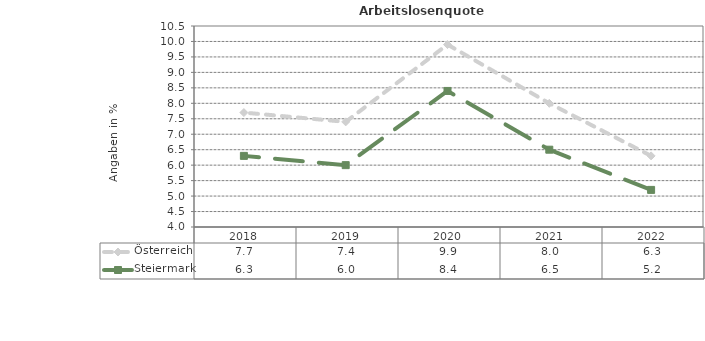
| Category | Österreich | Steiermark |
|---|---|---|
| 2022.0 | 6.3 | 5.2 |
| 2021.0 | 8 | 6.5 |
| 2020.0 | 9.9 | 8.4 |
| 2019.0 | 7.4 | 6 |
| 2018.0 | 7.7 | 6.3 |